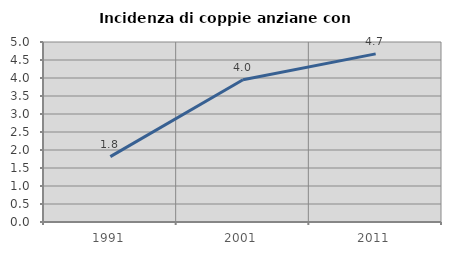
| Category | Incidenza di coppie anziane con figli |
|---|---|
| 1991.0 | 1.817 |
| 2001.0 | 3.953 |
| 2011.0 | 4.669 |